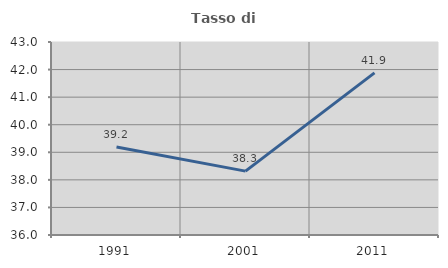
| Category | Tasso di occupazione   |
|---|---|
| 1991.0 | 39.189 |
| 2001.0 | 38.316 |
| 2011.0 | 41.88 |